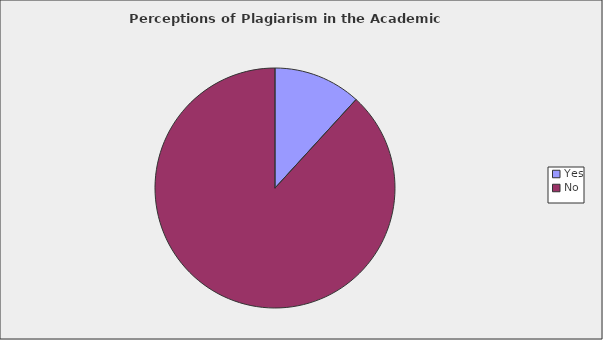
| Category | Series 0 |
|---|---|
| Yes | 0.118 |
| No | 0.882 |